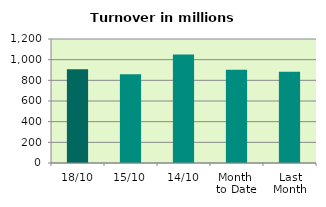
| Category | Series 0 |
|---|---|
| 18/10 | 906.749 |
| 15/10 | 857.843 |
| 14/10 | 1048.977 |
| Month 
to Date | 903.444 |
| Last
Month | 883.598 |